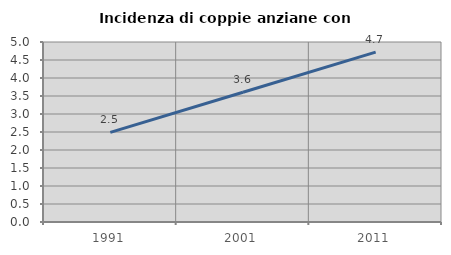
| Category | Incidenza di coppie anziane con figli |
|---|---|
| 1991.0 | 2.489 |
| 2001.0 | 3.604 |
| 2011.0 | 4.718 |